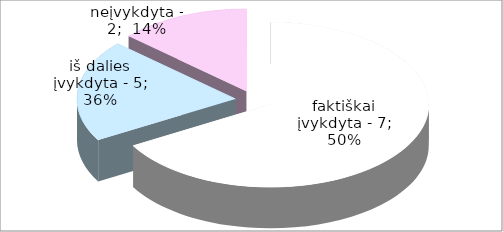
| Category | Series 0 | Series 1 | Series 2 | Series 3 | Series 4 | Series 5 | Series 6 | Series 7 | Series 8 | Series 9 | Series 10 |
|---|---|---|---|---|---|---|---|---|---|---|---|
| Iš 2013 m. planuotų įvykdyti 15 priemonių (kurioms patvirtinti / skirti asignavimai):  | 10 |  |  |  |  |  |  |  |  |  |  |